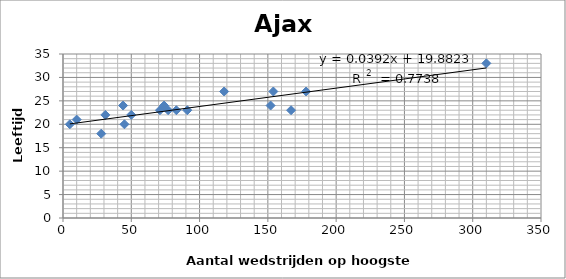
| Category | Wedstrijden |
|---|---|
| 5.0 | 20 |
| 10.0 | 21 |
| 28.0 | 18 |
| 45.0 | 20 |
| 31.0 | 22 |
| 44.0 | 24 |
| 50.0 | 22 |
| 74.0 | 24 |
| 71.0 | 23 |
| 77.0 | 23 |
| 83.0 | 23 |
| 91.0 | 23 |
| 118.0 | 27 |
| 152.0 | 24 |
| 154.0 | 27 |
| 167.0 | 23 |
| 178.0 | 27 |
| 310.0 | 33 |